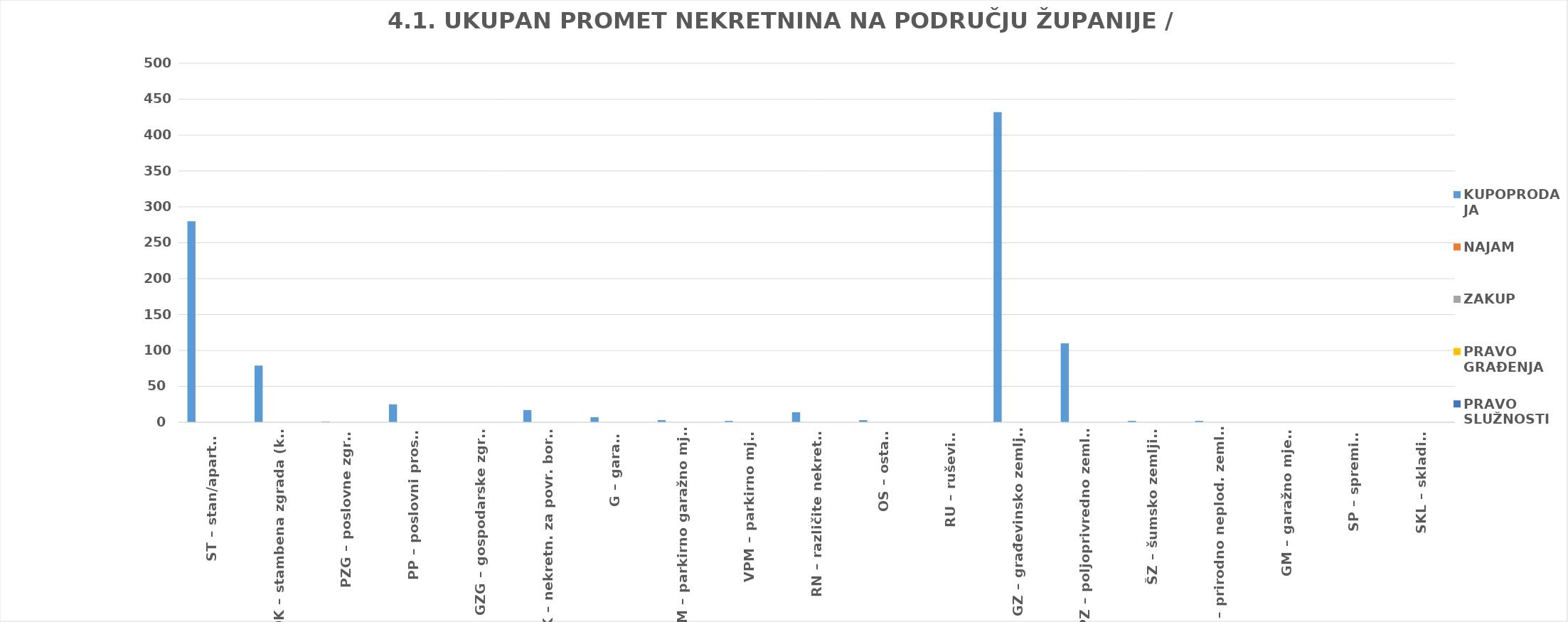
| Category | KUPOPRODAJA | NAJAM | ZAKUP | PRAVO GRAĐENJA | PRAVO SLUŽNOSTI |
|---|---|---|---|---|---|
| ST – stan/apartman | 280 | 0 | 0 | 0 | 0 |
| OK – stambena zgrada (kuća) | 79 | 0 | 0 | 0 | 0 |
| PZG – poslovne zgrade | 1 | 0 | 0 | 0 | 0 |
| PP – poslovni prostori | 25 | 0 | 0 | 0 | 0 |
| GZG – gospodarske zgrade | 0 | 0 | 0 | 0 | 0 |
| VIK – nekretn. za povr. boravak | 17 | 0 | 0 | 0 | 0 |
| G – garaža | 7 | 0 | 0 | 0 | 0 |
| PGM – parkirno garažno mjesto | 3 | 0 | 0 | 0 | 0 |
| VPM – parkirno mjesto | 2 | 0 | 0 | 0 | 0 |
| RN – različite nekretnine | 14 | 0 | 0 | 0 | 0 |
| OS – ostalo | 3 | 0 | 0 | 0 | 0 |
| RU – ruševine | 0 | 0 | 0 | 0 | 0 |
| GZ – građevinsko zemljište | 432 | 0 | 0 | 0 | 0 |
| PZ – poljoprivredno zemljište | 110 | 0 | 0 | 0 | 0 |
| ŠZ – šumsko zemljište | 2 | 0 | 0 | 0 | 0 |
| PNZ – prirodno neplod. zemljište | 2 | 0 | 0 | 0 | 0 |
| GM – garažno mjesto | 0 | 0 | 0 | 0 | 0 |
| SP – spremište | 0 | 0 | 0 | 0 | 0 |
| SKL – skladište | 0 | 0 | 0 | 0 | 0 |